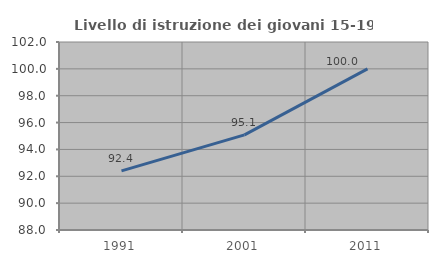
| Category | Livello di istruzione dei giovani 15-19 anni |
|---|---|
| 1991.0 | 92.405 |
| 2001.0 | 95.082 |
| 2011.0 | 100 |